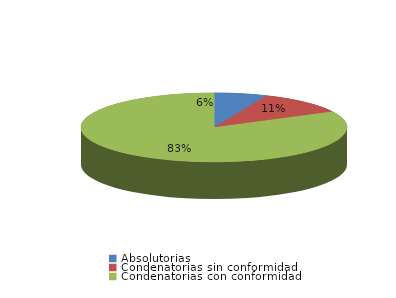
| Category | Series 0 |
|---|---|
| Absolutorias | 30 |
| Condenatorias sin conformidad | 51 |
| Condenatorias con conformidad | 384 |